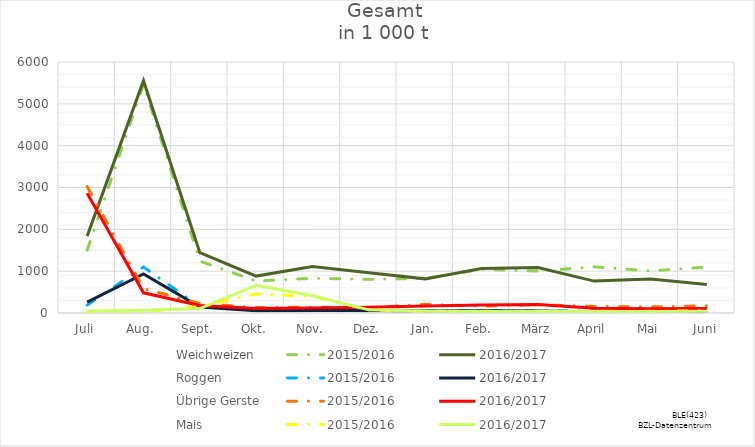
| Category | Weichweizen | 2015/2016 | 2016/2017 | Roggen | Übrige Gerste | Mais |
|---|---|---|---|---|---|---|
| Juli |  | 28.741 | 48.205 |  |  |  |
| Aug. |  | 24.607 | 66.07 |  |  |  |
| Sept. |  | 155.967 | 105.141 |  |  |  |
| Okt. |  | 455.945 | 660.619 |  |  |  |
| Nov. |  | 399.024 | 410.749 |  |  |  |
| Dez. |  | 75.786 | 75.69 |  |  |  |
| Jan. |  | 31.504 | 43.262 |  |  |  |
| Feb. |  | 37.058 | 34.97 |  |  |  |
| März |  | 32.281 | 38.52 |  |  |  |
| April |  | 36.808 | 34.154 |  |  |  |
| Mai |  | 39.102 | 37.046 |  |  |  |
| Juni |  | 52.965 | 42.118 |  |  |  |